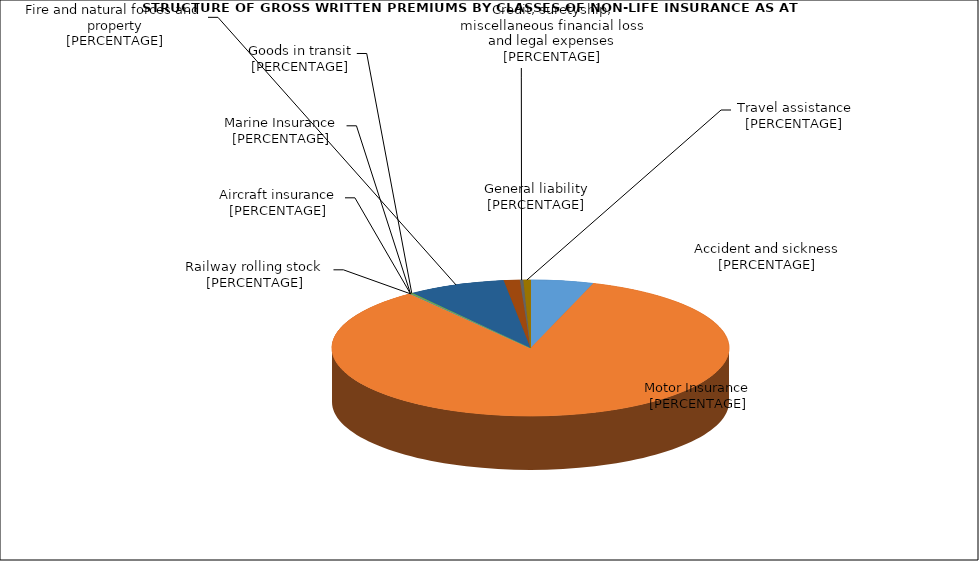
| Category | Series 1 | Злополука и заболяване |
|---|---|---|
| Злополука и заболяване | 0.051 | 0.072 |
| МПС | 0.846 | 0.632 |
| Релсови превозни средства | 0 | 0 |
| Летателни апарати | 0 | 0.007 |
| Плаванелни съдове | 0 | 0.003 |
| Товари по време на превоз | 0.002 | 0.01 |
| Пожар и природни бедствия и други щети на имущество | 0.079 | 0.21 |
| Обща гражданска отговорност | 0.013 | 0.03 |
| Кредити, гаранции, разни финансови загуби и правни разноски | 0.003 | 0.027 |
| Помощ при пътуване | 0.006 | 0.009 |